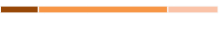
| Category | Series 0 | Series 1 | Series 2 |
|---|---|---|---|
| 0 | 0.175 | 0.593 | 0.232 |